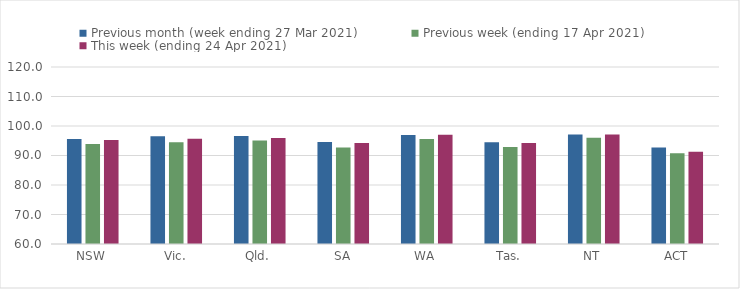
| Category | Previous month (week ending 27 Mar 2021) | Previous week (ending 17 Apr 2021) | This week (ending 24 Apr 2021) |
|---|---|---|---|
| NSW | 95.63 | 93.94 | 95.24 |
| Vic. | 96.52 | 94.53 | 95.71 |
| Qld. | 96.6 | 95.1 | 95.94 |
| SA | 94.57 | 92.75 | 94.25 |
| WA | 96.95 | 95.61 | 97.05 |
| Tas. | 94.45 | 92.88 | 94.21 |
| NT | 97.08 | 96.01 | 97.08 |
| ACT | 92.72 | 90.75 | 91.26 |